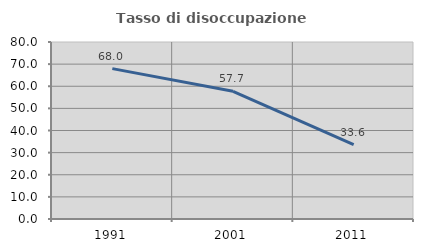
| Category | Tasso di disoccupazione giovanile  |
|---|---|
| 1991.0 | 67.971 |
| 2001.0 | 57.724 |
| 2011.0 | 33.582 |